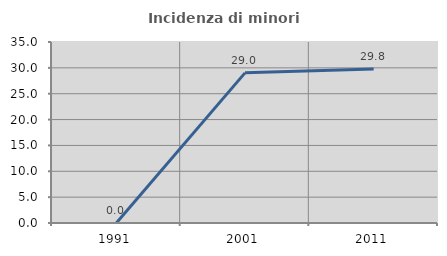
| Category | Incidenza di minori stranieri |
|---|---|
| 1991.0 | 0 |
| 2001.0 | 29.032 |
| 2011.0 | 29.756 |